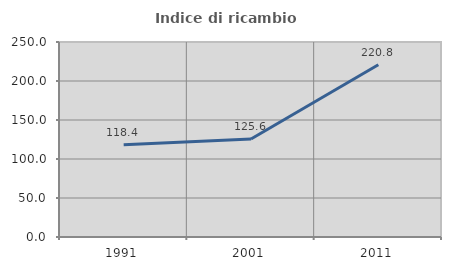
| Category | Indice di ricambio occupazionale  |
|---|---|
| 1991.0 | 118.415 |
| 2001.0 | 125.554 |
| 2011.0 | 220.796 |